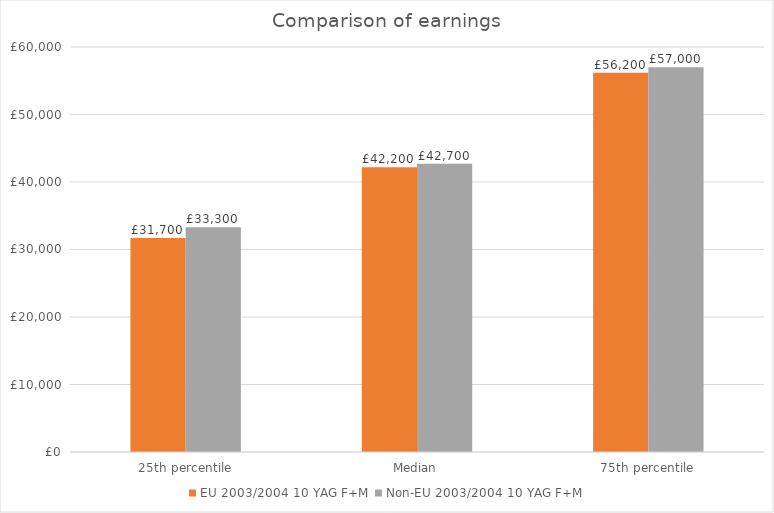
| Category | Series 0 | EU | Non-EU |
|---|---|---|---|
| 25th percentile |  | 31700 | 33300 |
| Median |  | 42200 | 42700 |
| 75th percentile |  | 56200 | 57000 |